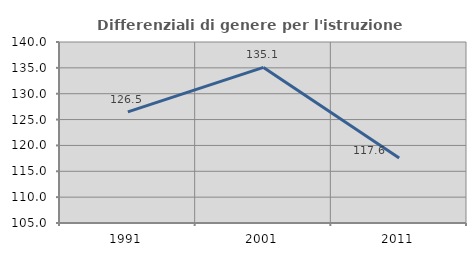
| Category | Differenziali di genere per l'istruzione superiore |
|---|---|
| 1991.0 | 126.478 |
| 2001.0 | 135.09 |
| 2011.0 | 117.582 |